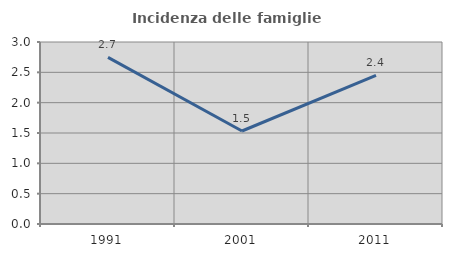
| Category | Incidenza delle famiglie numerose |
|---|---|
| 1991.0 | 2.746 |
| 2001.0 | 1.533 |
| 2011.0 | 2.449 |